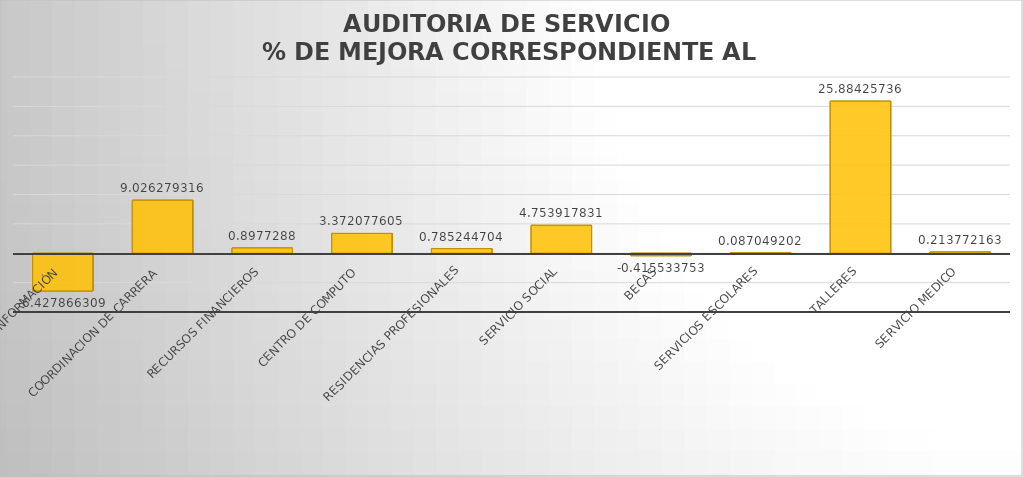
| Category | MEJORA |
|---|---|
| CENTRO DE INFORMACIÓN | -6.428 |
| COORDINACION DE CARRERA | 9.026 |
| RECURSOS FINANCIEROS | 0.898 |
| CENTRO DE COMPUTO | 3.372 |
| RESIDENCIAS PROFESIONALES | 0.785 |
| SERVICIO SOCIAL | 4.754 |
| BECAS | -0.416 |
| SERVICIOS ESCOLARES | 0.087 |
| TALLERES | 25.884 |
| SERVICIO MEDICO | 0.214 |